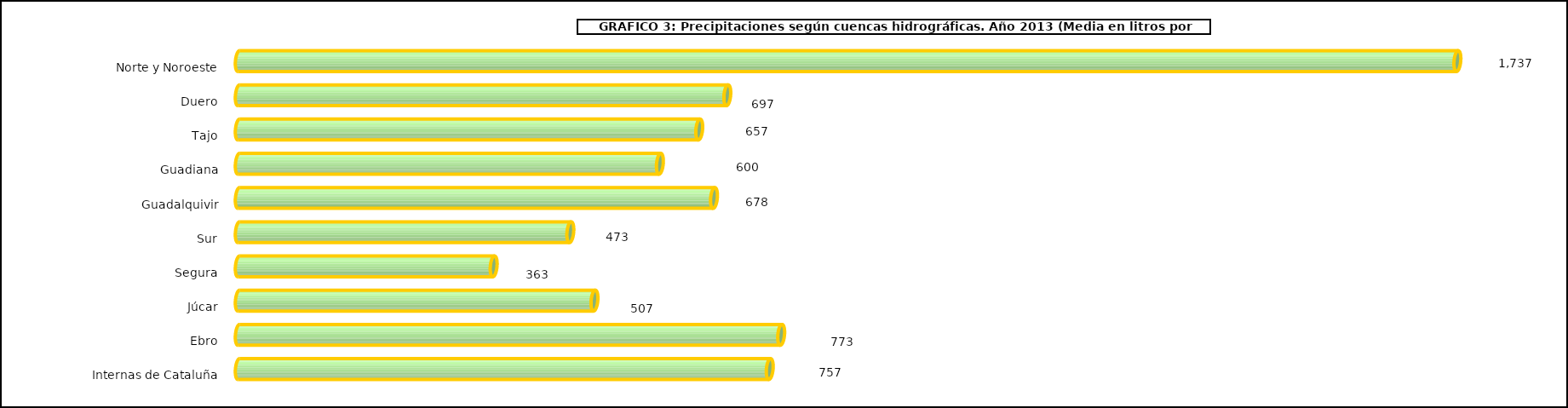
| Category | cuencas |
|---|---|
| 0 | 1737.4 |
| 1 | 696.5 |
| 2 | 656.5 |
| 3 | 600.4 |
| 4 | 677.5 |
| 5 | 472.7 |
| 6 | 363.4 |
| 7 | 507.1 |
| 8 | 773.3 |
| 9 | 757 |